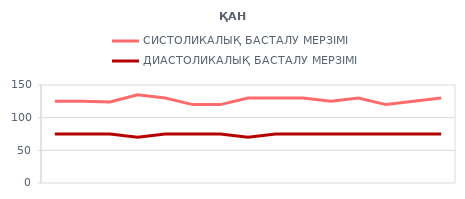
| Category | СИСТОЛИКАЛЫҚ БАСТАЛУ МЕРЗІМІ | ДИАСТОЛИКАЛЫҚ БАСТАЛУ МЕРЗІМІ |
|---|---|---|
| 2012-06-01 | 125 | 75 |
| 2012-06-02 | 125 | 75 |
| 2012-06-03 | 124 | 75 |
| 2012-06-04 | 135 | 70 |
| 2012-06-05 | 130 | 75 |
| 2012-06-06 | 120 | 75 |
| 2012-06-07 | 120 | 75 |
| 2012-06-08 | 130 | 70 |
| 2012-06-09 | 130 | 75 |
| 2012-06-10 | 130 | 75 |
| 2012-06-11 | 125 | 75 |
| 2012-06-12 | 130 | 75 |
| 2012-06-13 | 120 | 75 |
| 2012-06-14 | 125 | 75 |
| 2012-06-15 | 130 | 75 |